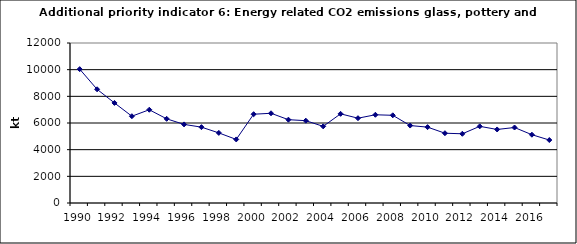
| Category | Energy related CO2 emissions from glass, pottery and building materials, kt |
|---|---|
| 1990 | 10038.446 |
| 1991 | 8526.893 |
| 1992 | 7505.479 |
| 1993 | 6508.81 |
| 1994 | 6994.038 |
| 1995 | 6312.66 |
| 1996 | 5894.729 |
| 1997 | 5689.333 |
| 1998 | 5257.576 |
| 1999 | 4767.593 |
| 2000 | 6657.469 |
| 2001 | 6729.653 |
| 2002 | 6248.575 |
| 2003 | 6173.785 |
| 2004 | 5748.453 |
| 2005 | 6686.896 |
| 2006 | 6359.855 |
| 2007 | 6617.185 |
| 2008 | 6576.881 |
| 2009 | 5808.965 |
| 2010 | 5690.39 |
| 2011 | 5233.968 |
| 2012 | 5190.713 |
| 2013 | 5750.061 |
| 2014 | 5514.864 |
| 2015 | 5662.004 |
| 2016 | 5121.409 |
| 2017 | 4722.13 |